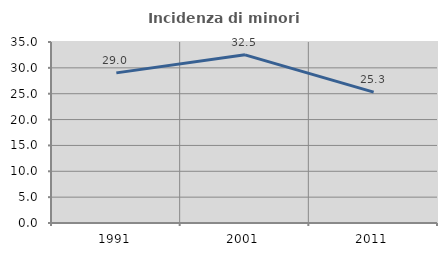
| Category | Incidenza di minori stranieri |
|---|---|
| 1991.0 | 29.032 |
| 2001.0 | 32.518 |
| 2011.0 | 25.297 |